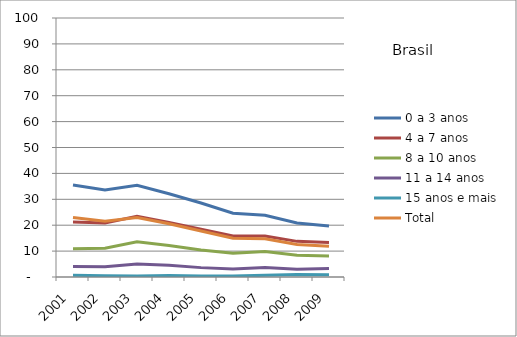
| Category | 0 a 3 anos | 4 a 7 anos | 8 a 10 anos | 11 a 14 anos | 15 anos e mais | Total |
|---|---|---|---|---|---|---|
| 2001 | 35.51 | 21.23 | 10.87 | 4.06 | 0.63 | 22.93 |
| 2002 | 33.58 | 20.85 | 11.11 | 3.95 | 0.52 | 21.53 |
| 2003 | 35.44 | 23.44 | 13.58 | 5.02 | 0.43 | 23.01 |
| 2004 | 32.16 | 21.07 | 12.15 | 4.52 | 0.59 | 20.59 |
| 2005 | 28.59 | 18.43 | 10.43 | 3.62 | 0.38 | 17.79 |
| 2006 | 24.61 | 15.8 | 9.16 | 3.11 | 0.37 | 14.97 |
| 2007 | 23.87 | 15.85 | 9.88 | 3.67 | 0.64 | 14.73 |
| 2008 | 20.82 | 13.76 | 8.37 | 3.01 | 0.98 | 12.51 |
| 2009 | 19.72 | 13.28 | 8.13 | 3.28 | 0.87 | 11.87 |